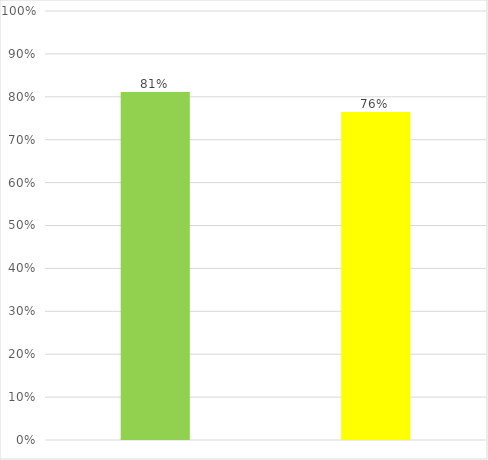
| Category | Series 0 |
|---|---|
| 0 | 0.811 |
| 1 | 0.765 |